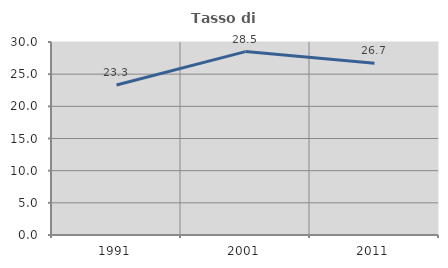
| Category | Tasso di occupazione   |
|---|---|
| 1991.0 | 23.323 |
| 2001.0 | 28.507 |
| 2011.0 | 26.693 |